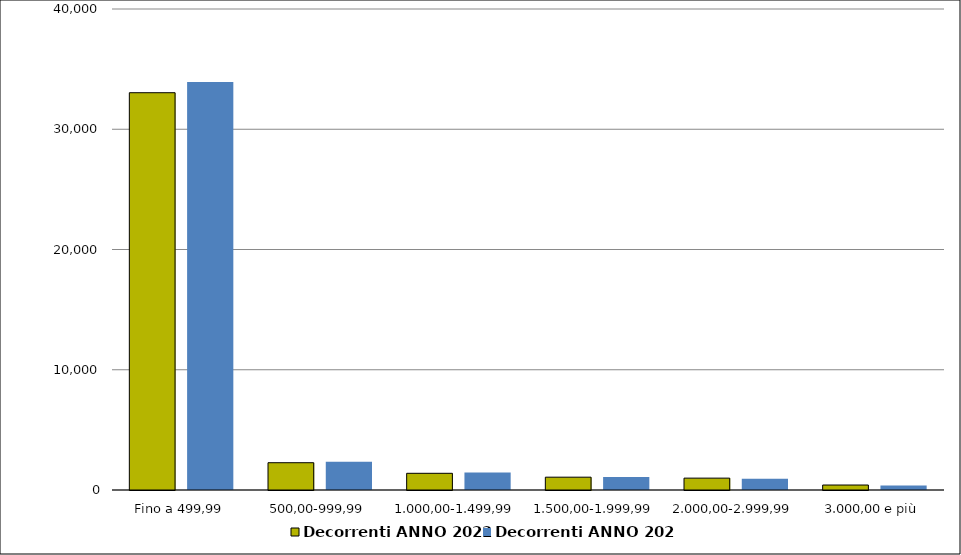
| Category | Decorrenti ANNO 2022 | Decorrenti ANNO 2021 |
|---|---|---|
|  Fino a 499,99  | 33038 | 33925 |
|  500,00-999,99  | 2269 | 2350 |
|  1.000,00-1.499,99  | 1389 | 1446 |
|  1.500,00-1.999,99  | 1066 | 1071 |
|  2.000,00-2.999,99  | 987 | 937 |
|  3.000,00 e più  | 414 | 380 |